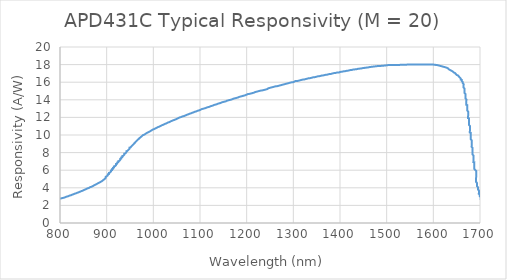
| Category | Responsivity (A/W) |
|---|---|
| 754.78339 | 1.872 |
| 756.94969 | 1.903 |
| 756.95966 | 1.934 |
| 759.12597 | 1.964 |
| 761.29227 | 1.995 |
| 761.30224 | 2.026 |
| 763.46854 | 2.057 |
| 763.47851 | 2.088 |
| 765.64481 | 2.119 |
| 767.81112 | 2.149 |
| 767.82109 | 2.18 |
| 769.98739 | 2.211 |
| 769.99736 | 2.242 |
| 772.16366 | 2.273 |
| 774.32996 | 2.303 |
| 776.49627 | 2.334 |
| 776.50624 | 2.365 |
| 778.67254 | 2.396 |
| 780.83884 | 2.427 |
| 780.84881 | 2.458 |
| 783.01511 | 2.488 |
| 785.18142 | 2.519 |
| 787.34772 | 2.55 |
| 789.51402 | 2.581 |
| 789.52399 | 2.612 |
| 791.69029 | 2.642 |
| 793.8566 | 2.673 |
| 796.0229 | 2.704 |
| 798.1892 | 2.735 |
| 798.19917 | 2.766 |
| 798.20914 | 2.797 |
| 800.36547 | 2.797 |
| 802.5218 | 2.797 |
| 804.6881 | 2.827 |
| 806.85441 | 2.858 |
| 809.02071 | 2.889 |
| 811.18701 | 2.92 |
| 811.19698 | 2.951 |
| 813.36328 | 2.981 |
| 815.52959 | 3.012 |
| 817.69589 | 3.043 |
| 817.70586 | 3.074 |
| 819.87216 | 3.105 |
| 822.03846 | 3.136 |
| 824.20476 | 3.166 |
| 824.21474 | 3.197 |
| 826.38104 | 3.228 |
| 828.54734 | 3.259 |
| 828.55731 | 3.29 |
| 830.72361 | 3.32 |
| 832.88991 | 3.351 |
| 835.05622 | 3.382 |
| 835.06619 | 3.413 |
| 837.23249 | 3.444 |
| 839.39879 | 3.475 |
| 839.40876 | 3.505 |
| 841.57506 | 3.536 |
| 843.74137 | 3.567 |
| 843.75134 | 3.598 |
| 845.91764 | 3.629 |
| 848.08394 | 3.66 |
| 848.09391 | 3.69 |
| 850.26022 | 3.721 |
| 850.27019 | 3.752 |
| 852.43649 | 3.783 |
| 854.60279 | 3.814 |
| 854.61276 | 3.844 |
| 856.77906 | 3.875 |
| 856.78904 | 3.906 |
| 856.79901 | 3.937 |
| 858.95534 | 3.937 |
| 861.12164 | 3.968 |
| 861.13161 | 3.999 |
| 863.29791 | 4.029 |
| 863.30788 | 4.06 |
| 865.47419 | 4.091 |
| 867.64049 | 4.122 |
| 867.65046 | 4.153 |
| 869.81676 | 4.183 |
| 869.82673 | 4.214 |
| 871.99303 | 4.245 |
| 872.00301 | 4.276 |
| 874.16931 | 4.307 |
| 874.17928 | 4.338 |
| 876.34558 | 4.368 |
| 876.35555 | 4.399 |
| 878.52185 | 4.43 |
| 878.53183 | 4.461 |
| 880.69813 | 4.492 |
| 880.7081 | 4.523 |
| 882.8744 | 4.553 |
| 882.88437 | 4.584 |
| 885.05067 | 4.615 |
| 885.06065 | 4.646 |
| 887.22695 | 4.677 |
| 887.23692 | 4.707 |
| 889.40322 | 4.738 |
| 889.41319 | 4.769 |
| 889.42316 | 4.8 |
| 891.58947 | 4.831 |
| 891.59944 | 4.862 |
| 891.60941 | 4.892 |
| 893.77571 | 4.923 |
| 893.78568 | 4.954 |
| 893.79565 | 4.985 |
| 895.96196 | 5.016 |
| 895.97193 | 5.047 |
| 895.9819 | 5.077 |
| 895.99187 | 5.108 |
| 898.15817 | 5.139 |
| 898.16814 | 5.17 |
| 898.17811 | 5.201 |
| 898.18809 | 5.232 |
| 898.19806 | 5.262 |
| 898.20803 | 5.293 |
| 900.37433 | 5.324 |
| 900.3843 | 5.355 |
| 900.39427 | 5.386 |
| 902.56058 | 5.416 |
| 902.57055 | 5.447 |
| 902.58052 | 5.478 |
| 902.59049 | 5.509 |
| 902.60046 | 5.54 |
| 904.76676 | 5.571 |
| 904.77673 | 5.601 |
| 904.78671 | 5.632 |
| 904.79668 | 5.663 |
| 904.80665 | 5.694 |
| 906.97295 | 5.725 |
| 906.98292 | 5.756 |
| 906.99289 | 5.786 |
| 907.00287 | 5.817 |
| 909.16917 | 5.848 |
| 909.17914 | 5.879 |
| 909.18911 | 5.91 |
| 909.19908 | 5.94 |
| 909.20905 | 5.971 |
| 911.37536 | 6.002 |
| 911.38533 | 6.033 |
| 911.3953 | 6.064 |
| 911.40527 | 6.095 |
| 911.41524 | 6.125 |
| 913.58154 | 6.156 |
| 913.59151 | 6.187 |
| 913.60149 | 6.218 |
| 913.61146 | 6.249 |
| 913.62143 | 6.28 |
| 915.78773 | 6.31 |
| 915.7977 | 6.341 |
| 915.80767 | 6.372 |
| 915.81764 | 6.403 |
| 915.82762 | 6.434 |
| 917.99392 | 6.465 |
| 918.00389 | 6.495 |
| 918.01386 | 6.526 |
| 918.02383 | 6.557 |
| 920.19013 | 6.588 |
| 920.20011 | 6.619 |
| 920.21008 | 6.649 |
| 920.22005 | 6.68 |
| 920.23002 | 6.711 |
| 922.39632 | 6.742 |
| 922.40629 | 6.773 |
| 922.41627 | 6.804 |
| 922.42624 | 6.834 |
| 922.43621 | 6.865 |
| 924.60251 | 6.896 |
| 924.61248 | 6.927 |
| 924.62245 | 6.958 |
| 924.63242 | 6.989 |
| 924.6424 | 7.019 |
| 926.8087 | 7.05 |
| 926.81867 | 7.081 |
| 926.82864 | 7.112 |
| 926.83861 | 7.143 |
| 929.00491 | 7.174 |
| 929.01489 | 7.204 |
| 929.02486 | 7.235 |
| 929.03483 | 7.266 |
| 929.0448 | 7.297 |
| 931.2111 | 7.328 |
| 931.22107 | 7.358 |
| 931.23104 | 7.389 |
| 931.24102 | 7.42 |
| 931.25099 | 7.451 |
| 933.41729 | 7.482 |
| 933.42726 | 7.513 |
| 933.43723 | 7.543 |
| 933.4472 | 7.574 |
| 933.45718 | 7.605 |
| 935.62348 | 7.636 |
| 935.63345 | 7.667 |
| 935.64342 | 7.698 |
| 935.65339 | 7.728 |
| 937.81969 | 7.759 |
| 937.82967 | 7.79 |
| 937.83964 | 7.821 |
| 937.84961 | 7.852 |
| 937.85958 | 7.883 |
| 940.02588 | 7.913 |
| 940.03585 | 7.944 |
| 940.04582 | 7.975 |
| 940.0558 | 8.006 |
| 942.2221 | 8.037 |
| 942.23207 | 8.067 |
| 942.24204 | 8.098 |
| 942.25201 | 8.129 |
| 942.26198 | 8.16 |
| 944.42829 | 8.191 |
| 944.43826 | 8.222 |
| 944.44823 | 8.252 |
| 944.4582 | 8.283 |
| 946.6245 | 8.314 |
| 946.63447 | 8.345 |
| 946.64444 | 8.376 |
| 946.65442 | 8.407 |
| 948.82072 | 8.437 |
| 948.83069 | 8.468 |
| 948.84066 | 8.499 |
| 948.85063 | 8.53 |
| 948.8606 | 8.561 |
| 951.02691 | 8.592 |
| 951.03688 | 8.622 |
| 951.04685 | 8.653 |
| 951.05682 | 8.684 |
| 953.22312 | 8.715 |
| 953.23309 | 8.746 |
| 953.24306 | 8.776 |
| 953.25304 | 8.807 |
| 955.41934 | 8.838 |
| 955.42931 | 8.869 |
| 955.43928 | 8.9 |
| 955.44925 | 8.931 |
| 957.61555 | 8.961 |
| 957.62553 | 8.992 |
| 957.6355 | 9.023 |
| 957.64547 | 9.054 |
| 959.81177 | 9.085 |
| 959.82174 | 9.116 |
| 959.83171 | 9.146 |
| 959.84169 | 9.177 |
| 962.00799 | 9.208 |
| 962.01796 | 9.239 |
| 962.02793 | 9.27 |
| 962.0379 | 9.301 |
| 964.2042 | 9.331 |
| 964.21417 | 9.362 |
| 964.22415 | 9.393 |
| 964.23412 | 9.424 |
| 966.40042 | 9.455 |
| 966.41039 | 9.485 |
| 966.42036 | 9.516 |
| 968.58666 | 9.547 |
| 968.59664 | 9.578 |
| 968.60661 | 9.609 |
| 968.61658 | 9.64 |
| 970.78288 | 9.67 |
| 970.79285 | 9.701 |
| 970.80282 | 9.732 |
| 972.96913 | 9.763 |
| 972.9791 | 9.794 |
| 972.98907 | 9.825 |
| 975.15537 | 9.855 |
| 975.16534 | 9.886 |
| 975.17531 | 9.917 |
| 975.18528 | 9.948 |
| 977.35159 | 9.979 |
| 979.51789 | 10.009 |
| 979.52786 | 10.04 |
| 981.69416 | 10.071 |
| 981.70413 | 10.102 |
| 981.7141 | 10.133 |
| 983.88041 | 10.164 |
| 983.89038 | 10.194 |
| 986.05668 | 10.225 |
| 986.06665 | 10.256 |
| 988.23295 | 10.287 |
| 988.24292 | 10.318 |
| 990.40923 | 10.349 |
| 990.4192 | 10.379 |
| 992.5855 | 10.41 |
| 992.59547 | 10.441 |
| 994.76177 | 10.472 |
| 994.77174 | 10.503 |
| 994.78172 | 10.533 |
| 996.94802 | 10.564 |
| 996.95799 | 10.595 |
| 999.12429 | 10.626 |
| 1001.29059 | 10.657 |
| 1001.30056 | 10.688 |
| 1003.46687 | 10.718 |
| 1003.47684 | 10.749 |
| 1005.64314 | 10.78 |
| 1005.65311 | 10.811 |
| 1007.81941 | 10.842 |
| 1007.82938 | 10.873 |
| 1009.99569 | 10.903 |
| 1012.16199 | 10.934 |
| 1012.17196 | 10.965 |
| 1014.33826 | 10.996 |
| 1014.34823 | 11.027 |
| 1016.51453 | 11.057 |
| 1016.52451 | 11.088 |
| 1018.69081 | 11.119 |
| 1020.85711 | 11.15 |
| 1020.86708 | 11.181 |
| 1023.03338 | 11.212 |
| 1023.04335 | 11.242 |
| 1025.20966 | 11.273 |
| 1027.37596 | 11.304 |
| 1027.38593 | 11.335 |
| 1029.55223 | 11.366 |
| 1029.5622 | 11.396 |
| 1031.72851 | 11.427 |
| 1033.89481 | 11.458 |
| 1033.90478 | 11.489 |
| 1036.07108 | 11.52 |
| 1036.08105 | 11.551 |
| 1038.24735 | 11.581 |
| 1040.41366 | 11.612 |
| 1040.42363 | 11.643 |
| 1042.58993 | 11.674 |
| 1044.75623 | 11.705 |
| 1044.7662 | 11.736 |
| 1046.9325 | 11.766 |
| 1049.09881 | 11.797 |
| 1049.10878 | 11.828 |
| 1051.27508 | 11.859 |
| 1051.28505 | 11.89 |
| 1053.45135 | 11.92 |
| 1053.46132 | 11.951 |
| 1055.62763 | 11.982 |
| 1057.79393 | 12.013 |
| 1059.96023 | 12.044 |
| 1059.9702 | 12.075 |
| 1062.1365 | 12.105 |
| 1064.30281 | 12.136 |
| 1066.46911 | 12.167 |
| 1066.47908 | 12.198 |
| 1068.64538 | 12.229 |
| 1070.81168 | 12.259 |
| 1070.82165 | 12.29 |
| 1072.98796 | 12.321 |
| 1075.15426 | 12.352 |
| 1075.16423 | 12.383 |
| 1077.33053 | 12.414 |
| 1079.49683 | 12.444 |
| 1081.66313 | 12.475 |
| 1081.67311 | 12.506 |
| 1083.83941 | 12.537 |
| 1086.00571 | 12.568 |
| 1086.01568 | 12.598 |
| 1088.18198 | 12.629 |
| 1090.34828 | 12.66 |
| 1092.51459 | 12.691 |
| 1092.52456 | 12.722 |
| 1094.69086 | 12.753 |
| 1096.85716 | 12.783 |
| 1099.02346 | 12.814 |
| 1099.03344 | 12.845 |
| 1101.19974 | 12.876 |
| 1101.20971 | 12.907 |
| 1101.21968 | 12.938 |
| 1103.37601 | 12.938 |
| 1105.54231 | 12.968 |
| 1107.70861 | 12.999 |
| 1109.87492 | 13.03 |
| 1112.04122 | 13.061 |
| 1112.05119 | 13.092 |
| 1114.21749 | 13.122 |
| 1116.38379 | 13.153 |
| 1118.55009 | 13.184 |
| 1120.7164 | 13.215 |
| 1120.72637 | 13.246 |
| 1122.89267 | 13.276 |
| 1125.05897 | 13.307 |
| 1127.22527 | 13.338 |
| 1127.23525 | 13.369 |
| 1129.40155 | 13.4 |
| 1131.56785 | 13.431 |
| 1133.73415 | 13.461 |
| 1135.90045 | 13.492 |
| 1135.91042 | 13.523 |
| 1138.07673 | 13.554 |
| 1140.24303 | 13.585 |
| 1142.40933 | 13.616 |
| 1144.57563 | 13.646 |
| 1144.5856 | 13.677 |
| 1146.7519 | 13.708 |
| 1148.91821 | 13.739 |
| 1151.08451 | 13.77 |
| 1153.25081 | 13.8 |
| 1155.41711 | 13.831 |
| 1155.42708 | 13.862 |
| 1157.59339 | 13.893 |
| 1159.75969 | 13.924 |
| 1159.76966 | 13.955 |
| 1161.92599 | 13.955 |
| 1164.09229 | 13.985 |
| 1166.25859 | 14.016 |
| 1168.4249 | 14.047 |
| 1168.43487 | 14.078 |
| 1170.60117 | 14.109 |
| 1172.76747 | 14.139 |
| 1174.93377 | 14.17 |
| 1177.10007 | 14.201 |
| 1179.26638 | 14.232 |
| 1181.43268 | 14.263 |
| 1181.44265 | 14.294 |
| 1183.60895 | 14.324 |
| 1185.77525 | 14.355 |
| 1187.94155 | 14.386 |
| 1190.10786 | 14.417 |
| 1192.27416 | 14.448 |
| 1194.44046 | 14.478 |
| 1196.60676 | 14.509 |
| 1196.61673 | 14.54 |
| 1198.78304 | 14.571 |
| 1200.94934 | 14.602 |
| 1200.95931 | 14.633 |
| 1200.96928 | 14.663 |
| 1203.12561 | 14.663 |
| 1205.28194 | 14.663 |
| 1207.44824 | 14.694 |
| 1209.61454 | 14.725 |
| 1211.78085 | 14.756 |
| 1213.94715 | 14.787 |
| 1216.11345 | 14.817 |
| 1216.12342 | 14.848 |
| 1218.28972 | 14.879 |
| 1220.45603 | 14.91 |
| 1222.62233 | 14.941 |
| 1224.78863 | 14.972 |
| 1226.95493 | 15.002 |
| 1229.12123 | 15.033 |
| 1231.28753 | 15.064 |
| 1233.44387 | 15.064 |
| 1233.45384 | 15.095 |
| 1235.61017 | 15.095 |
| 1235.62014 | 15.126 |
| 1237.77647 | 15.126 |
| 1237.78644 | 15.156 |
| 1239.94277 | 15.156 |
| 1239.95274 | 15.187 |
| 1242.10907 | 15.187 |
| 1242.11904 | 15.218 |
| 1244.27537 | 15.218 |
| 1244.28535 | 15.249 |
| 1244.29532 | 15.28 |
| 1246.46162 | 15.311 |
| 1248.62792 | 15.341 |
| 1250.79422 | 15.372 |
| 1252.96053 | 15.403 |
| 1255.12683 | 15.434 |
| 1257.29313 | 15.465 |
| 1259.45943 | 15.495 |
| 1261.62573 | 15.526 |
| 1263.78206 | 15.526 |
| 1263.79203 | 15.557 |
| 1265.94836 | 15.557 |
| 1265.95834 | 15.588 |
| 1268.11467 | 15.588 |
| 1268.12464 | 15.619 |
| 1270.28097 | 15.619 |
| 1270.29094 | 15.649 |
| 1272.44727 | 15.649 |
| 1272.45724 | 15.68 |
| 1274.61357 | 15.68 |
| 1274.62354 | 15.711 |
| 1276.77987 | 15.711 |
| 1278.94618 | 15.742 |
| 1281.11248 | 15.773 |
| 1283.27878 | 15.804 |
| 1285.44508 | 15.834 |
| 1287.61138 | 15.865 |
| 1289.77769 | 15.896 |
| 1291.94399 | 15.927 |
| 1291.95396 | 15.958 |
| 1294.11029 | 15.958 |
| 1294.12026 | 15.988 |
| 1296.27659 | 15.988 |
| 1298.43292 | 15.988 |
| 1300.59922 | 16.019 |
| 1300.60919 | 16.05 |
| 1300.61917 | 16.081 |
| 1302.7755 | 16.081 |
| 1302.78547 | 16.112 |
| 1302.79544 | 16.143 |
| 1304.95177 | 16.143 |
| 1307.1081 | 16.143 |
| 1309.26443 | 16.143 |
| 1311.43073 | 16.173 |
| 1313.59703 | 16.204 |
| 1315.76334 | 16.235 |
| 1317.92964 | 16.266 |
| 1320.09594 | 16.297 |
| 1322.25227 | 16.297 |
| 1324.41857 | 16.327 |
| 1326.58487 | 16.358 |
| 1328.75118 | 16.389 |
| 1330.91748 | 16.42 |
| 1330.92745 | 16.451 |
| 1333.08378 | 16.451 |
| 1335.24011 | 16.451 |
| 1337.40641 | 16.481 |
| 1339.57271 | 16.512 |
| 1341.73902 | 16.543 |
| 1343.90532 | 16.574 |
| 1346.06165 | 16.574 |
| 1348.22795 | 16.605 |
| 1350.39425 | 16.636 |
| 1352.56055 | 16.666 |
| 1354.71688 | 16.666 |
| 1356.88319 | 16.697 |
| 1359.04949 | 16.728 |
| 1361.21579 | 16.759 |
| 1363.37212 | 16.759 |
| 1365.53842 | 16.79 |
| 1367.70472 | 16.82 |
| 1369.87103 | 16.851 |
| 1372.02736 | 16.851 |
| 1374.19366 | 16.882 |
| 1376.35996 | 16.913 |
| 1378.52626 | 16.944 |
| 1380.68259 | 16.944 |
| 1382.84889 | 16.974 |
| 1385.0152 | 17.005 |
| 1387.1815 | 17.036 |
| 1389.33783 | 17.036 |
| 1391.50413 | 17.067 |
| 1393.67043 | 17.098 |
| 1395.82676 | 17.098 |
| 1397.98309 | 17.098 |
| 1397.99306 | 17.129 |
| 1400.15937 | 17.159 |
| 1402.32567 | 17.19 |
| 1404.482 | 17.19 |
| 1406.6483 | 17.221 |
| 1408.8146 | 17.252 |
| 1410.97093 | 17.252 |
| 1413.13723 | 17.283 |
| 1415.30354 | 17.313 |
| 1417.45987 | 17.313 |
| 1419.62617 | 17.344 |
| 1421.79247 | 17.375 |
| 1423.9488 | 17.375 |
| 1426.1151 | 17.406 |
| 1428.2814 | 17.437 |
| 1430.43773 | 17.437 |
| 1432.60404 | 17.467 |
| 1434.76037 | 17.467 |
| 1436.92667 | 17.498 |
| 1439.09297 | 17.529 |
| 1441.2493 | 17.529 |
| 1443.4156 | 17.56 |
| 1445.57193 | 17.56 |
| 1447.73823 | 17.591 |
| 1449.90454 | 17.622 |
| 1452.06087 | 17.622 |
| 1454.22717 | 17.652 |
| 1456.3835 | 17.652 |
| 1458.5498 | 17.683 |
| 1460.70613 | 17.683 |
| 1462.87243 | 17.714 |
| 1465.02876 | 17.714 |
| 1467.19507 | 17.745 |
| 1469.3514 | 17.745 |
| 1471.5177 | 17.776 |
| 1473.67403 | 17.776 |
| 1475.84033 | 17.806 |
| 1477.99666 | 17.806 |
| 1480.16296 | 17.837 |
| 1482.31929 | 17.837 |
| 1484.47562 | 17.837 |
| 1486.63195 | 17.837 |
| 1488.79826 | 17.868 |
| 1490.95459 | 17.868 |
| 1493.11092 | 17.868 |
| 1495.27722 | 17.899 |
| 1497.43355 | 17.899 |
| 1497.44352 | 17.93 |
| 1499.59985 | 17.93 |
| 1501.75618 | 17.93 |
| 1503.92248 | 17.96 |
| 1506.07881 | 17.96 |
| 1508.23514 | 17.96 |
| 1510.39147 | 17.96 |
| 1512.5478 | 17.96 |
| 1514.70413 | 17.96 |
| 1516.86046 | 17.96 |
| 1519.0168 | 17.96 |
| 1521.17313 | 17.96 |
| 1523.32946 | 17.96 |
| 1525.48579 | 17.96 |
| 1527.64212 | 17.96 |
| 1529.80842 | 17.991 |
| 1531.96475 | 17.991 |
| 1534.12108 | 17.991 |
| 1536.27741 | 17.991 |
| 1538.43374 | 17.991 |
| 1540.59007 | 17.991 |
| 1542.7464 | 17.991 |
| 1544.9127 | 18.022 |
| 1547.06903 | 18.022 |
| 1549.22536 | 18.022 |
| 1551.38169 | 18.022 |
| 1553.53802 | 18.022 |
| 1555.69435 | 18.022 |
| 1557.85069 | 18.022 |
| 1560.00702 | 18.022 |
| 1562.16335 | 18.022 |
| 1564.31968 | 18.022 |
| 1566.47601 | 18.022 |
| 1568.63234 | 18.022 |
| 1570.78867 | 18.022 |
| 1572.945 | 18.022 |
| 1575.10133 | 18.022 |
| 1577.25766 | 18.022 |
| 1579.41399 | 18.022 |
| 1581.57032 | 18.022 |
| 1583.72665 | 18.022 |
| 1585.88298 | 18.022 |
| 1588.03931 | 18.022 |
| 1590.19564 | 18.022 |
| 1592.35197 | 18.022 |
| 1594.5083 | 18.022 |
| 1596.66463 | 18.021 |
| 1598.82096 | 18.021 |
| 1600.96732 | 17.991 |
| 1603.12365 | 17.991 |
| 1603.11368 | 17.96 |
| 1605.27001 | 17.96 |
| 1607.42634 | 17.96 |
| 1609.5727 | 17.929 |
| 1611.71906 | 17.898 |
| 1613.86542 | 17.867 |
| 1616.01178 | 17.836 |
| 1618.15814 | 17.806 |
| 1620.30449 | 17.775 |
| 1622.45085 | 17.744 |
| 1624.59721 | 17.713 |
| 1626.74357 | 17.682 |
| 1626.7336 | 17.651 |
| 1628.87996 | 17.621 |
| 1631.02632 | 17.59 |
| 1631.01635 | 17.559 |
| 1631.00638 | 17.528 |
| 1630.9964 | 17.497 |
| 1633.14276 | 17.466 |
| 1633.13279 | 17.436 |
| 1635.27915 | 17.405 |
| 1635.26918 | 17.374 |
| 1637.41554 | 17.343 |
| 1637.40557 | 17.312 |
| 1639.55192 | 17.281 |
| 1639.54195 | 17.251 |
| 1641.68831 | 17.22 |
| 1641.67834 | 17.189 |
| 1641.66837 | 17.158 |
| 1643.81473 | 17.127 |
| 1643.80476 | 17.096 |
| 1645.95112 | 17.066 |
| 1645.94114 | 17.035 |
| 1645.93117 | 17.004 |
| 1648.07753 | 16.973 |
| 1648.06756 | 16.942 |
| 1648.05759 | 16.911 |
| 1650.20395 | 16.881 |
| 1650.19398 | 16.85 |
| 1650.184 | 16.819 |
| 1652.33036 | 16.788 |
| 1652.32039 | 16.757 |
| 1652.31042 | 16.726 |
| 1654.45678 | 16.696 |
| 1654.44681 | 16.665 |
| 1654.43684 | 16.634 |
| 1654.42687 | 16.603 |
| 1656.57322 | 16.572 |
| 1656.56325 | 16.541 |
| 1656.55328 | 16.511 |
| 1656.54331 | 16.48 |
| 1656.53334 | 16.449 |
| 1658.6797 | 16.418 |
| 1658.66973 | 16.387 |
| 1658.65975 | 16.356 |
| 1658.64978 | 16.326 |
| 1658.63981 | 16.295 |
| 1660.78617 | 16.264 |
| 1660.7762 | 16.233 |
| 1660.76623 | 16.202 |
| 1660.75626 | 16.171 |
| 1660.74628 | 16.141 |
| 1660.73631 | 16.11 |
| 1662.88267 | 16.079 |
| 1662.8727 | 16.048 |
| 1662.86273 | 16.017 |
| 1662.85276 | 15.986 |
| 1662.84279 | 15.956 |
| 1662.83281 | 15.925 |
| 1662.82284 | 15.894 |
| 1662.81287 | 15.863 |
| 1662.8029 | 15.832 |
| 1662.79293 | 15.801 |
| 1664.93929 | 15.771 |
| 1664.92932 | 15.74 |
| 1664.91934 | 15.709 |
| 1664.90937 | 15.678 |
| 1664.8994 | 15.647 |
| 1664.88943 | 15.616 |
| 1664.87946 | 15.586 |
| 1664.86949 | 15.555 |
| 1664.85952 | 15.524 |
| 1664.84954 | 15.493 |
| 1664.83957 | 15.462 |
| 1664.8296 | 15.432 |
| 1664.81963 | 15.401 |
| 1664.80966 | 15.37 |
| 1664.79969 | 15.339 |
| 1666.94605 | 15.308 |
| 1666.93607 | 15.277 |
| 1666.9261 | 15.247 |
| 1666.91613 | 15.216 |
| 1666.90616 | 15.185 |
| 1666.89619 | 15.154 |
| 1666.88622 | 15.123 |
| 1666.87625 | 15.092 |
| 1666.86627 | 15.062 |
| 1666.8563 | 15.031 |
| 1666.84633 | 15 |
| 1666.83636 | 14.969 |
| 1666.82639 | 14.938 |
| 1666.81642 | 14.907 |
| 1666.80645 | 14.877 |
| 1666.79647 | 14.846 |
| 1666.7865 | 14.815 |
| 1666.77653 | 14.784 |
| 1666.76656 | 14.753 |
| 1668.91292 | 14.722 |
| 1668.90295 | 14.692 |
| 1668.89298 | 14.661 |
| 1668.883 | 14.63 |
| 1668.87303 | 14.599 |
| 1668.86306 | 14.568 |
| 1668.85309 | 14.537 |
| 1668.84312 | 14.507 |
| 1668.83315 | 14.476 |
| 1668.82318 | 14.445 |
| 1668.8132 | 14.414 |
| 1668.80323 | 14.383 |
| 1668.79326 | 14.352 |
| 1668.78329 | 14.322 |
| 1668.77332 | 14.291 |
| 1668.76335 | 14.26 |
| 1668.75337 | 14.229 |
| 1668.7434 | 14.198 |
| 1668.73343 | 14.168 |
| 1668.72346 | 14.137 |
| 1668.71349 | 14.106 |
| 1670.85985 | 14.075 |
| 1670.84988 | 14.044 |
| 1670.8399 | 14.013 |
| 1670.82993 | 13.983 |
| 1670.81996 | 13.952 |
| 1670.80999 | 13.921 |
| 1670.80002 | 13.89 |
| 1670.79005 | 13.859 |
| 1670.78008 | 13.828 |
| 1670.7701 | 13.798 |
| 1670.76013 | 13.767 |
| 1670.75016 | 13.736 |
| 1670.74019 | 13.705 |
| 1670.73022 | 13.674 |
| 1670.72025 | 13.643 |
| 1670.71028 | 13.613 |
| 1670.7003 | 13.582 |
| 1670.69033 | 13.551 |
| 1670.68036 | 13.52 |
| 1670.67039 | 13.489 |
| 1670.66042 | 13.458 |
| 1670.65045 | 13.428 |
| 1672.79681 | 13.397 |
| 1672.78683 | 13.366 |
| 1672.77686 | 13.335 |
| 1672.76689 | 13.304 |
| 1672.75692 | 13.273 |
| 1672.74695 | 13.243 |
| 1672.73698 | 13.212 |
| 1672.72701 | 13.181 |
| 1672.71703 | 13.15 |
| 1672.70706 | 13.119 |
| 1672.69709 | 13.089 |
| 1672.68712 | 13.058 |
| 1672.67715 | 13.027 |
| 1672.66718 | 12.996 |
| 1672.65721 | 12.965 |
| 1672.64723 | 12.934 |
| 1672.63726 | 12.904 |
| 1672.62729 | 12.873 |
| 1672.61732 | 12.842 |
| 1672.60735 | 12.811 |
| 1672.59738 | 12.78 |
| 1672.58741 | 12.749 |
| 1672.57743 | 12.719 |
| 1672.56746 | 12.688 |
| 1674.71382 | 12.657 |
| 1674.70385 | 12.626 |
| 1674.69388 | 12.595 |
| 1674.68391 | 12.564 |
| 1674.67394 | 12.534 |
| 1674.66396 | 12.503 |
| 1674.65399 | 12.472 |
| 1674.64402 | 12.441 |
| 1674.63405 | 12.41 |
| 1674.62408 | 12.379 |
| 1674.61411 | 12.349 |
| 1674.60413 | 12.318 |
| 1674.59416 | 12.287 |
| 1674.58419 | 12.256 |
| 1674.57422 | 12.225 |
| 1674.56425 | 12.194 |
| 1674.55428 | 12.164 |
| 1674.54431 | 12.133 |
| 1674.53433 | 12.102 |
| 1674.52436 | 12.071 |
| 1674.51439 | 12.04 |
| 1674.50442 | 12.01 |
| 1674.49445 | 11.979 |
| 1674.48448 | 11.948 |
| 1674.47451 | 11.917 |
| 1676.62086 | 11.886 |
| 1676.61089 | 11.855 |
| 1676.60092 | 11.825 |
| 1676.59095 | 11.794 |
| 1676.58098 | 11.763 |
| 1676.57101 | 11.732 |
| 1676.56104 | 11.701 |
| 1676.55106 | 11.67 |
| 1676.54109 | 11.64 |
| 1676.53112 | 11.609 |
| 1676.52115 | 11.578 |
| 1676.51118 | 11.547 |
| 1676.50121 | 11.516 |
| 1676.49124 | 11.485 |
| 1676.48126 | 11.455 |
| 1676.47129 | 11.424 |
| 1676.46132 | 11.393 |
| 1676.45135 | 11.362 |
| 1676.44138 | 11.331 |
| 1676.43141 | 11.3 |
| 1676.42144 | 11.27 |
| 1676.41146 | 11.239 |
| 1676.40149 | 11.208 |
| 1676.39152 | 11.177 |
| 1676.38155 | 11.146 |
| 1676.37158 | 11.115 |
| 1678.51794 | 11.085 |
| 1678.50797 | 11.054 |
| 1678.49799 | 11.023 |
| 1678.48802 | 10.992 |
| 1678.47805 | 10.961 |
| 1678.46808 | 10.93 |
| 1678.45811 | 10.9 |
| 1678.44814 | 10.869 |
| 1678.43817 | 10.838 |
| 1678.42819 | 10.807 |
| 1678.41822 | 10.776 |
| 1678.40825 | 10.746 |
| 1678.39828 | 10.715 |
| 1678.38831 | 10.684 |
| 1678.37834 | 10.653 |
| 1678.36836 | 10.622 |
| 1678.35839 | 10.591 |
| 1678.34842 | 10.561 |
| 1678.33845 | 10.53 |
| 1678.32848 | 10.499 |
| 1678.31851 | 10.468 |
| 1678.30854 | 10.437 |
| 1678.29856 | 10.406 |
| 1678.28859 | 10.376 |
| 1678.27862 | 10.345 |
| 1678.26865 | 10.314 |
| 1678.25868 | 10.283 |
| 1680.40504 | 10.252 |
| 1680.39507 | 10.221 |
| 1680.38509 | 10.191 |
| 1680.37512 | 10.16 |
| 1680.36515 | 10.129 |
| 1680.35518 | 10.098 |
| 1680.34521 | 10.067 |
| 1680.33524 | 10.036 |
| 1680.32527 | 10.006 |
| 1680.31529 | 9.975 |
| 1680.30532 | 9.944 |
| 1680.29535 | 9.913 |
| 1680.28538 | 9.882 |
| 1680.27541 | 9.851 |
| 1680.26544 | 9.821 |
| 1680.25547 | 9.79 |
| 1680.24549 | 9.759 |
| 1680.23552 | 9.728 |
| 1680.22555 | 9.697 |
| 1680.21558 | 9.666 |
| 1680.20561 | 9.636 |
| 1680.19564 | 9.605 |
| 1680.18567 | 9.574 |
| 1680.17569 | 9.543 |
| 1680.16572 | 9.512 |
| 1680.15575 | 9.482 |
| 1680.14578 | 9.451 |
| 1682.29214 | 9.42 |
| 1682.28217 | 9.389 |
| 1682.2722 | 9.358 |
| 1682.26222 | 9.327 |
| 1682.25225 | 9.297 |
| 1682.24228 | 9.266 |
| 1682.23231 | 9.235 |
| 1682.22234 | 9.204 |
| 1682.21237 | 9.173 |
| 1682.2024 | 9.142 |
| 1682.19242 | 9.112 |
| 1682.18245 | 9.081 |
| 1682.17248 | 9.05 |
| 1682.16251 | 9.019 |
| 1682.15254 | 8.988 |
| 1682.14257 | 8.957 |
| 1682.13259 | 8.927 |
| 1682.12262 | 8.896 |
| 1682.11265 | 8.865 |
| 1682.10268 | 8.834 |
| 1682.09271 | 8.803 |
| 1682.08274 | 8.772 |
| 1682.07277 | 8.742 |
| 1682.06279 | 8.711 |
| 1682.05282 | 8.68 |
| 1682.04285 | 8.649 |
| 1682.03288 | 8.618 |
| 1684.17924 | 8.587 |
| 1684.16927 | 8.557 |
| 1684.1593 | 8.526 |
| 1684.14932 | 8.495 |
| 1684.13935 | 8.464 |
| 1684.12938 | 8.433 |
| 1684.11941 | 8.403 |
| 1684.10944 | 8.372 |
| 1684.09947 | 8.341 |
| 1684.0895 | 8.31 |
| 1684.07952 | 8.279 |
| 1684.06955 | 8.248 |
| 1684.05958 | 8.218 |
| 1684.04961 | 8.187 |
| 1684.03964 | 8.156 |
| 1684.02967 | 8.125 |
| 1684.0197 | 8.094 |
| 1684.00972 | 8.063 |
| 1683.99975 | 8.033 |
| 1683.98978 | 8.002 |
| 1683.97981 | 7.971 |
| 1683.96984 | 7.94 |
| 1683.95987 | 7.909 |
| 1683.9499 | 7.878 |
| 1683.93992 | 7.848 |
| 1683.92995 | 7.817 |
| 1683.91998 | 7.786 |
| 1683.91001 | 7.755 |
| 1686.05637 | 7.724 |
| 1686.0464 | 7.693 |
| 1686.03643 | 7.663 |
| 1686.02645 | 7.632 |
| 1686.01648 | 7.601 |
| 1686.00651 | 7.57 |
| 1685.99654 | 7.539 |
| 1685.98657 | 7.508 |
| 1685.9766 | 7.478 |
| 1685.96662 | 7.447 |
| 1685.95665 | 7.416 |
| 1685.94668 | 7.385 |
| 1685.93671 | 7.354 |
| 1685.92674 | 7.324 |
| 1685.91677 | 7.293 |
| 1685.9068 | 7.262 |
| 1685.89682 | 7.231 |
| 1685.88685 | 7.2 |
| 1685.87688 | 7.169 |
| 1685.86691 | 7.139 |
| 1685.85694 | 7.108 |
| 1685.84697 | 7.077 |
| 1685.837 | 7.046 |
| 1685.82702 | 7.015 |
| 1685.81705 | 6.984 |
| 1685.80708 | 6.954 |
| 1685.79711 | 6.923 |
| 1687.94347 | 6.892 |
| 1687.9335 | 6.861 |
| 1687.92353 | 6.83 |
| 1687.91355 | 6.799 |
| 1687.90358 | 6.769 |
| 1687.89361 | 6.738 |
| 1687.88364 | 6.707 |
| 1687.87367 | 6.676 |
| 1687.8637 | 6.645 |
| 1687.85373 | 6.614 |
| 1687.84375 | 6.584 |
| 1687.83378 | 6.553 |
| 1687.82381 | 6.522 |
| 1687.81384 | 6.491 |
| 1687.80387 | 6.46 |
| 1687.7939 | 6.429 |
| 1687.78393 | 6.399 |
| 1687.77395 | 6.368 |
| 1687.76398 | 6.337 |
| 1687.75401 | 6.306 |
| 1687.74404 | 6.275 |
| 1687.73407 | 6.244 |
| 1687.7241 | 6.214 |
| 1687.71413 | 6.183 |
| 1687.70415 | 6.152 |
| 1687.69418 | 6.121 |
| 1687.68421 | 6.09 |
| 1687.67424 | 6.06 |
| 1689.8206 | 6.029 |
| 1689.81063 | 5.998 |
| 1689.80066 | 5.967 |
| 1691.94701 | 5.936 |
| 1691.93704 | 5.905 |
| 1691.92707 | 5.875 |
| 1691.9171 | 5.844 |
| 1691.90713 | 5.813 |
| 1691.89716 | 5.782 |
| 1691.88719 | 5.751 |
| 1691.87721 | 5.72 |
| 1691.86724 | 5.69 |
| 1691.85727 | 5.659 |
| 1691.8473 | 5.628 |
| 1691.83733 | 5.597 |
| 1691.82736 | 5.566 |
| 1691.81738 | 5.535 |
| 1691.80741 | 5.505 |
| 1691.79744 | 5.474 |
| 1691.78747 | 5.443 |
| 1691.7775 | 5.412 |
| 1691.76753 | 5.381 |
| 1691.75756 | 5.35 |
| 1691.74758 | 5.32 |
| 1691.73761 | 5.289 |
| 1691.72764 | 5.258 |
| 1691.71767 | 5.227 |
| 1691.7077 | 5.196 |
| 1691.69773 | 5.165 |
| 1691.68776 | 5.135 |
| 1691.67778 | 5.104 |
| 1691.66781 | 5.073 |
| 1691.65784 | 5.042 |
| 1691.64787 | 5.011 |
| 1691.6379 | 4.98 |
| 1691.62793 | 4.95 |
| 1691.61796 | 4.919 |
| 1691.60798 | 4.888 |
| 1691.59801 | 4.857 |
| 1691.58804 | 4.826 |
| 1691.57807 | 4.796 |
| 1691.5681 | 4.765 |
| 1691.55813 | 4.734 |
| 1691.54816 | 4.703 |
| 1691.53818 | 4.672 |
| 1691.52821 | 4.641 |
| 1691.51824 | 4.611 |
| 1693.6646 | 4.58 |
| 1693.65463 | 4.549 |
| 1693.64466 | 4.518 |
| 1693.63469 | 4.487 |
| 1693.62471 | 4.456 |
| 1693.61474 | 4.426 |
| 1693.60477 | 4.395 |
| 1693.5948 | 4.364 |
| 1693.58483 | 4.333 |
| 1693.57486 | 4.302 |
| 1693.56489 | 4.271 |
| 1693.55491 | 4.241 |
| 1693.54494 | 4.21 |
| 1693.53497 | 4.179 |
| 1693.525 | 4.148 |
| 1693.51503 | 4.117 |
| 1693.50506 | 4.086 |
| 1695.65142 | 4.056 |
| 1695.64144 | 4.025 |
| 1695.63147 | 3.994 |
| 1695.6215 | 3.963 |
| 1695.61153 | 3.932 |
| 1695.60156 | 3.901 |
| 1695.59159 | 3.871 |
| 1695.58161 | 3.84 |
| 1695.57164 | 3.809 |
| 1695.56167 | 3.778 |
| 1695.5517 | 3.747 |
| 1697.69806 | 3.716 |
| 1697.68809 | 3.686 |
| 1697.67812 | 3.655 |
| 1697.66815 | 3.624 |
| 1697.65817 | 3.593 |
| 1697.6482 | 3.562 |
| 1697.63823 | 3.532 |
| 1697.62826 | 3.501 |
| 1697.61829 | 3.47 |
| 1697.60832 | 3.439 |
| 1697.59834 | 3.408 |
| 1697.58837 | 3.377 |
| 1697.5784 | 3.347 |
| 1697.56843 | 3.316 |
| 1699.71479 | 3.285 |
| 1699.70482 | 3.254 |
| 1699.69485 | 3.223 |
| 1699.68487 | 3.192 |
| 1699.6749 | 3.162 |
| 1699.66493 | 3.131 |
| 1699.65496 | 3.1 |
| 1699.64499 | 3.069 |
| 1699.63502 | 3.038 |
| 1699.62505 | 3.007 |
| 1699.61507 | 2.977 |
| 1699.6051 | 2.946 |
| 1701.75146 | 2.915 |
| 1701.74149 | 2.884 |
| 1701.73152 | 2.853 |
| 1701.72155 | 2.822 |
| 1701.71158 | 2.792 |
| 1701.7016 | 2.761 |
| 1701.69163 | 2.73 |
| 1701.68166 | 2.699 |
| 1701.67169 | 2.668 |
| 1701.66172 | 2.637 |
| 1701.65175 | 2.607 |
| 1703.79811 | 2.576 |
| 1703.78813 | 2.545 |
| 1703.77816 | 2.514 |
| 1703.76819 | 2.483 |
| 1703.75822 | 2.452 |
| 1703.74825 | 2.422 |
| 1703.73828 | 2.391 |
| 1703.72831 | 2.36 |
| 1703.71833 | 2.329 |
| 1705.86469 | 2.298 |
| 1705.85472 | 2.268 |
| 1705.84475 | 2.237 |
| 1705.83478 | 2.206 |
| 1705.82481 | 2.175 |
| 1705.81484 | 2.144 |
| 1705.80486 | 2.113 |
| 1705.79489 | 2.083 |
| 1707.94125 | 2.052 |
| 1707.93128 | 2.021 |
| 1707.92131 | 1.99 |
| 1707.91134 | 1.959 |
| 1707.90137 | 1.928 |
| 1707.89139 | 1.898 |
| 1710.03775 | 1.867 |
| 1710.02778 | 1.836 |
| 1710.01781 | 1.805 |
| 1710.00784 | 1.774 |
| 1709.99787 | 1.743 |
| 1709.9879 | 1.713 |
| 1712.13426 | 1.682 |
| 1712.12428 | 1.651 |
| 1712.11431 | 1.62 |
| 1712.10434 | 1.589 |
| 1712.09437 | 1.558 |
| 1712.0844 | 1.528 |
| 1714.23076 | 1.497 |
| 1714.22079 | 1.466 |
| 1714.21081 | 1.435 |
| 1714.20084 | 1.404 |
| 1716.3472 | 1.373 |
| 1716.33723 | 1.343 |
| 1716.32726 | 1.312 |
| 1716.31729 | 1.281 |
| 1718.46365 | 1.25 |
| 1718.45367 | 1.219 |
| 1718.4437 | 1.188 |
| 1718.43373 | 1.158 |
| 1720.58009 | 1.127 |
| 1720.57012 | 1.096 |
| 1720.56015 | 1.065 |
| 1720.55018 | 1.034 |
| 1722.69653 | 1.003 |
| 1722.68656 | 0.973 |
| 1722.67659 | 0.942 |
| 1724.82295 | 0.911 |
| 1724.81298 | 0.88 |
| 1726.95934 | 0.849 |
| 1726.94937 | 0.818 |
| 1726.9394 | 0.788 |
| 1729.08575 | 0.757 |
| 1729.07578 | 0.726 |
| 1731.22214 | 0.695 |
| 1731.21217 | 0.664 |
| 1733.35853 | 0.633 |
| 1733.34856 | 0.603 |
| 1735.49492 | 0.572 |
| 1735.48495 | 0.541 |
| 1737.6313 | 0.51 |
| 1739.77766 | 0.479 |
| 1739.76769 | 0.448 |
| 1741.91405 | 0.418 |
| 1744.06041 | 0.387 |
| 1746.20677 | 0.356 |
| 1746.1968 | 0.325 |
| 1748.34316 | 0.294 |
| 1750.48951 | 0.263 |
| 1752.63587 | 0.233 |
| 1754.7922 | 0.233 |
| 1756.93856 | 0.202 |
| 1759.09489 | 0.202 |